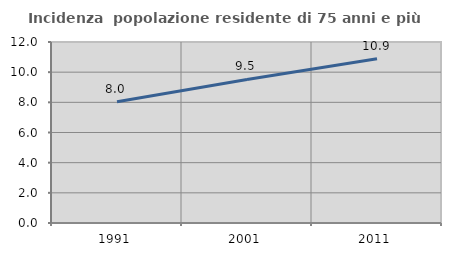
| Category | Incidenza  popolazione residente di 75 anni e più |
|---|---|
| 1991.0 | 8.039 |
| 2001.0 | 9.517 |
| 2011.0 | 10.885 |